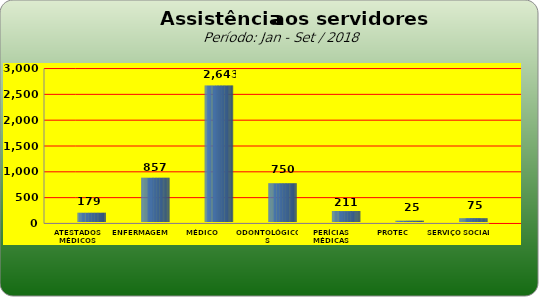
| Category | Series 0 |
|---|---|
| ATESTADOS MÉDICOS | 179 |
| ENFERMAGEM | 857 |
| MÉDICO | 2643 |
| ODONTOLÓGICOS | 750 |
| PERÍCIAS MÉDICAS | 211 |
| PROTEC | 25 |
| SERVIÇO SOCIAL | 75 |